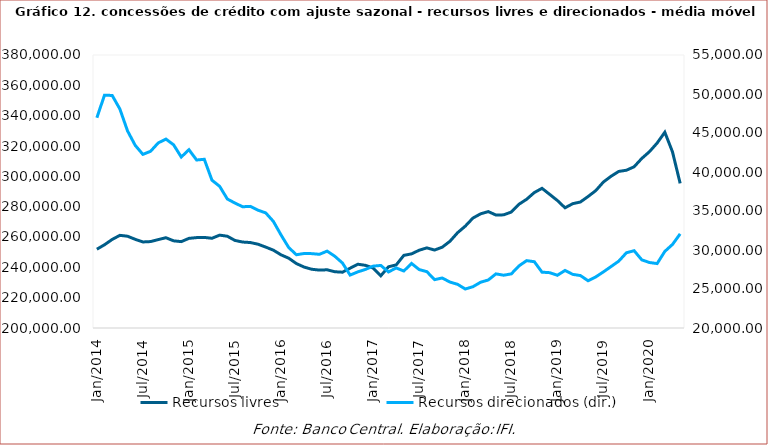
| Category | Recursos livres |
|---|---|
| 2014-01-01 | 251940 |
| 2014-02-01 | 254890.333 |
| 2014-03-01 | 258397 |
| 2014-04-01 | 261099 |
| 2014-05-01 | 260512.667 |
| 2014-06-01 | 258465.333 |
| 2014-07-01 | 256731.667 |
| 2014-08-01 | 256983.667 |
| 2014-09-01 | 258293 |
| 2014-10-01 | 259529.333 |
| 2014-11-01 | 257476 |
| 2014-12-01 | 256949 |
| 2015-01-01 | 259100.667 |
| 2015-02-01 | 259601.333 |
| 2015-03-01 | 259728.333 |
| 2015-04-01 | 259157 |
| 2015-05-01 | 261226 |
| 2015-06-01 | 260500 |
| 2015-07-01 | 257722.667 |
| 2015-08-01 | 256675 |
| 2015-09-01 | 256348.333 |
| 2015-10-01 | 255246.667 |
| 2015-11-01 | 253351 |
| 2015-12-01 | 251317 |
| 2016-01-01 | 248235.667 |
| 2016-02-01 | 246021.667 |
| 2016-03-01 | 242474.333 |
| 2016-04-01 | 240180.667 |
| 2016-05-01 | 238733 |
| 2016-06-01 | 238178.333 |
| 2016-07-01 | 238381.667 |
| 2016-08-01 | 237104 |
| 2016-09-01 | 236799 |
| 2016-10-01 | 239434 |
| 2016-11-01 | 242050 |
| 2016-12-01 | 241313 |
| 2017-01-01 | 239538.667 |
| 2017-02-01 | 234450 |
| 2017-03-01 | 240366.667 |
| 2017-04-01 | 241588.667 |
| 2017-05-01 | 247900.333 |
| 2017-06-01 | 248875.667 |
| 2017-07-01 | 251292.333 |
| 2017-08-01 | 252831.333 |
| 2017-09-01 | 251396.333 |
| 2017-10-01 | 253280.333 |
| 2017-11-01 | 257157.333 |
| 2017-12-01 | 262818.333 |
| 2018-01-01 | 267139 |
| 2018-02-01 | 272482.333 |
| 2018-03-01 | 275283.333 |
| 2018-04-01 | 276756 |
| 2018-05-01 | 274480.333 |
| 2018-06-01 | 274604 |
| 2018-07-01 | 276461.333 |
| 2018-08-01 | 281600.667 |
| 2018-09-01 | 284892.667 |
| 2018-10-01 | 289316.667 |
| 2018-11-01 | 292090.333 |
| 2018-12-01 | 288101.333 |
| 2019-01-01 | 284073.667 |
| 2019-02-01 | 279251 |
| 2019-03-01 | 281957.667 |
| 2019-04-01 | 283078.333 |
| 2019-05-01 | 286685.667 |
| 2019-06-01 | 290562.333 |
| 2019-07-01 | 296255.667 |
| 2019-08-01 | 300059 |
| 2019-09-01 | 303233.667 |
| 2019-10-01 | 304023.333 |
| 2019-11-01 | 306303 |
| 2019-12-01 | 311795.667 |
| 2020-01-01 | 316255 |
| 2020-02-01 | 321947.333 |
| 2020-03-01 | 329076.333 |
| 2020-04-01 | 316125 |
| 2020-05-01 | 295358 |